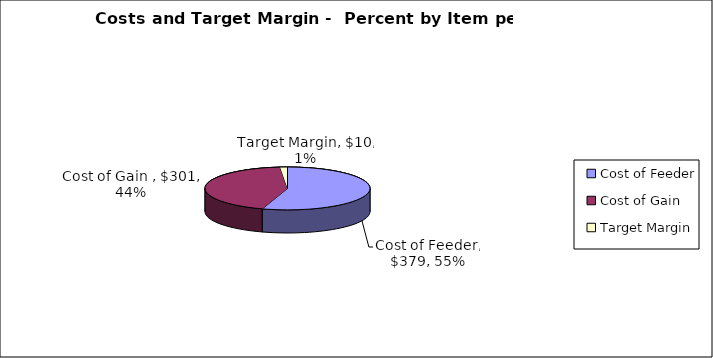
| Category | Series 0 |
|---|---|
| Cost of Feeder | 379.153 |
| Cost of Gain  | 301.063 |
| Target Margin | 10 |